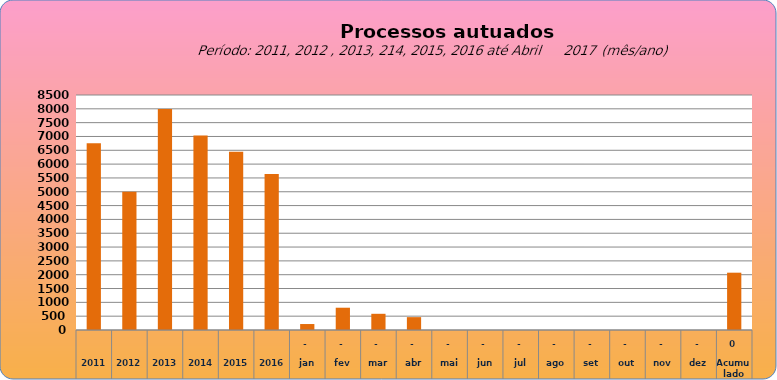
| Category | 6755 |
|---|---|
| 2011 | 6755 |
| 2012 | 4997 |
| 2013 | 7990 |
| 2014 | 7034 |
| 2015 | 6446 |
| 2016 | 5644 |
| jan | 216 |
| fev | 806 |
| mar | 586 |
| abr | 465 |
| mai | 0 |
| jun | 0 |
| jul | 0 |
| ago | 0 |
| set | 0 |
| out | 0 |
| nov | 0 |
| dez | 0 |
| Acumulado
 | 2073 |